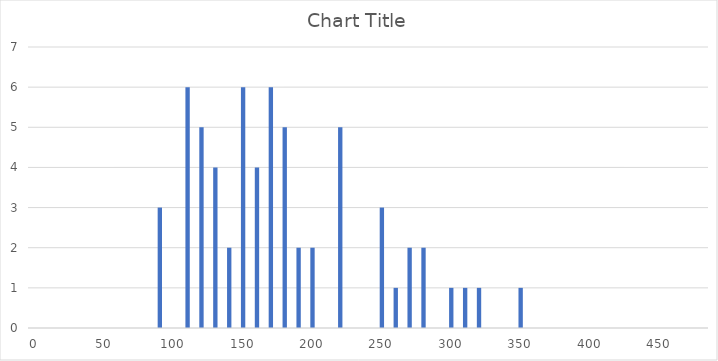
| Category | Series 0 |
|---|---|
| 0.0 | 0 |
| 10.0 | 0 |
| 20.0 | 0 |
| 30.0 | 0 |
| 40.0 | 0 |
| 50.0 | 0 |
| 60.0 | 0 |
| 70.0 | 0 |
| 80.0 | 0 |
| 90.0 | 3 |
| 100.0 | 0 |
| 110.0 | 6 |
| 120.0 | 5 |
| 130.0 | 4 |
| 140.0 | 2 |
| 150.0 | 6 |
| 160.0 | 4 |
| 170.0 | 6 |
| 180.0 | 5 |
| 190.0 | 2 |
| 200.0 | 2 |
| 210.0 | 0 |
| 220.0 | 5 |
| 230.0 | 0 |
| 240.0 | 0 |
| 250.0 | 3 |
| 260.0 | 1 |
| 270.0 | 2 |
| 280.0 | 2 |
| 290.0 | 0 |
| 300.0 | 1 |
| 310.0 | 1 |
| 320.0 | 1 |
| 330.0 | 0 |
| 340.0 | 0 |
| 350.0 | 1 |
| 360.0 | 0 |
| 370.0 | 0 |
| 380.0 | 0 |
| 390.0 | 0 |
| 400.0 | 0 |
| 410.0 | 0 |
| 420.0 | 0 |
| 430.0 | 0 |
| 440.0 | 0 |
| 450.0 | 0 |
| 460.0 | 0 |
| 470.0 | 0 |
| 480.0 | 0 |